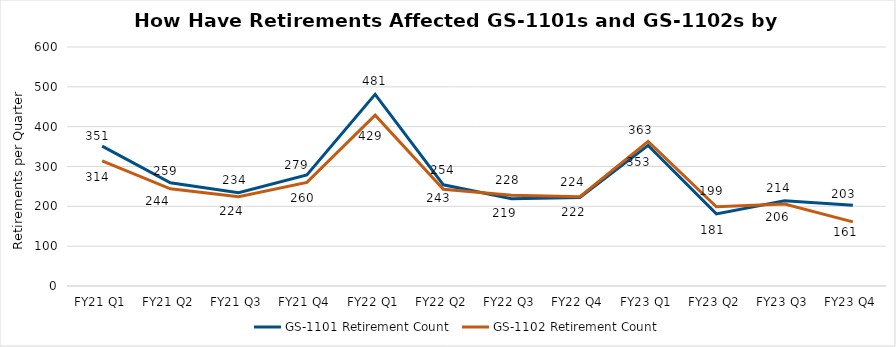
| Category | GS-1101 Retirement Count | GS-1102 Retirement Count |
|---|---|---|
| FY21 Q1 | 351 | 314 |
| FY21 Q2 | 259 | 244 |
| FY21 Q3 | 234 | 224 |
| FY21 Q4 | 279 | 260 |
| FY22 Q1 | 481 | 429 |
| FY22 Q2 | 254 | 243 |
| FY22 Q3 | 219 | 228 |
| FY22 Q4 | 222 | 224 |
| FY23 Q1 | 353 | 363 |
| FY23 Q2 | 181 | 199 |
| FY23 Q3 | 214 | 206 |
| FY23 Q4 | 203 | 161 |